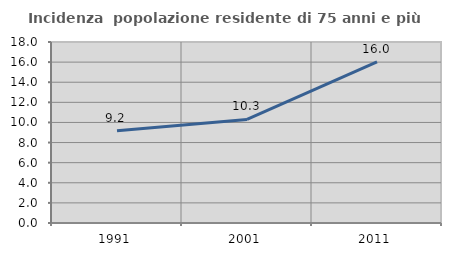
| Category | Incidenza  popolazione residente di 75 anni e più |
|---|---|
| 1991.0 | 9.168 |
| 2001.0 | 10.3 |
| 2011.0 | 16.026 |